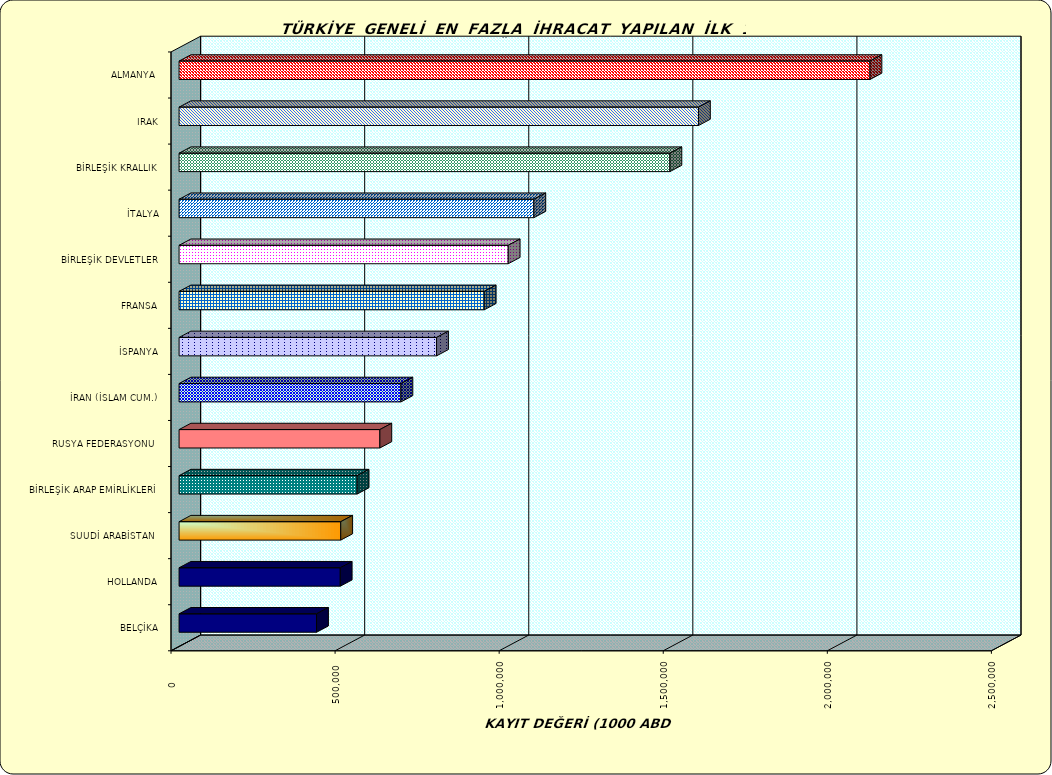
| Category | Series 0 |
|---|---|
| ALMANYA  | 2105418.27 |
| IRAK | 1582794.293 |
| BİRLEŞİK KRALLIK | 1495785.533 |
| İTALYA | 1081169.898 |
| BİRLEŞİK DEVLETLER | 1003031.251 |
| FRANSA | 929971.47 |
| İSPANYA | 784650.162 |
| İRAN (İSLAM CUM.) | 676111.958 |
| RUSYA FEDERASYONU  | 611847.482 |
| BİRLEŞİK ARAP EMİRLİKLERİ | 542592.598 |
| SUUDİ ARABİSTAN  | 492639.976 |
| HOLLANDA | 491208.822 |
| BELÇİKA | 419001.942 |